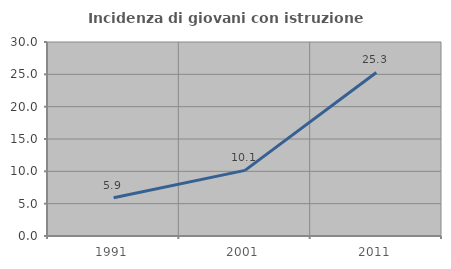
| Category | Incidenza di giovani con istruzione universitaria |
|---|---|
| 1991.0 | 5.901 |
| 2001.0 | 10.145 |
| 2011.0 | 25.285 |